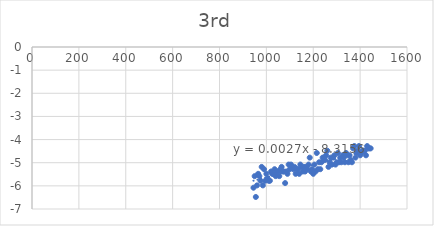
| Category | Series 0 |
|---|---|
| 945.0 | -6.08 |
| 950.0 | -5.58 |
| 955.0 | -6.48 |
| 960.0 | -5.98 |
| 965.0 | -5.48 |
| 970.0 | -5.58 |
| 975.0 | -5.78 |
| 980.0 | -5.18 |
| 985.0 | -5.98 |
| 990.0 | -5.28 |
| 995.0 | -5.78 |
| 1000.0 | -5.48 |
| 1005.0 | -5.68 |
| 1010.0 | -5.78 |
| 1015.0 | -5.78 |
| 1020.0 | -5.38 |
| 1025.0 | -5.48 |
| 1030.0 | -5.48 |
| 1035.0 | -5.28 |
| 1040.0 | -5.58 |
| 1045.0 | -5.38 |
| 1050.0 | -5.38 |
| 1055.0 | -5.58 |
| 1060.0 | -5.28 |
| 1065.0 | -5.18 |
| 1070.0 | -5.38 |
| 1075.0 | -5.38 |
| 1080.0 | -5.88 |
| 1085.0 | -5.38 |
| 1090.0 | -5.48 |
| 1095.0 | -5.08 |
| 1100.0 | -5.28 |
| 1105.0 | -5.08 |
| 1110.0 | -5.18 |
| 1115.0 | -5.28 |
| 1120.0 | -5.18 |
| 1125.0 | -5.48 |
| 1130.0 | -5.28 |
| 1135.0 | -5.28 |
| 1140.0 | -5.48 |
| 1145.0 | -5.08 |
| 1150.0 | -5.18 |
| 1155.0 | -5.38 |
| 1160.0 | -5.18 |
| 1165.0 | -5.38 |
| 1170.0 | -5.18 |
| 1175.0 | -5.28 |
| 1180.0 | -5.08 |
| 1185.0 | -4.78 |
| 1190.0 | -5.38 |
| 1195.0 | -5.28 |
| 1200.0 | -5.48 |
| 1205.0 | -5.08 |
| 1210.0 | -5.38 |
| 1215.0 | -4.58 |
| 1220.0 | -5.28 |
| 1225.0 | -4.98 |
| 1230.0 | -5.28 |
| 1235.0 | -4.98 |
| 1240.0 | -4.78 |
| 1245.0 | -4.78 |
| 1250.0 | -4.88 |
| 1255.0 | -4.68 |
| 1260.0 | -4.48 |
| 1265.0 | -5.18 |
| 1270.0 | -4.98 |
| 1275.0 | -4.78 |
| 1280.0 | -5.08 |
| 1285.0 | -4.78 |
| 1290.0 | -4.68 |
| 1295.0 | -5.08 |
| 1300.0 | -4.98 |
| 1305.0 | -4.58 |
| 1310.0 | -4.98 |
| 1315.0 | -4.78 |
| 1320.0 | -4.98 |
| 1325.0 | -4.68 |
| 1330.0 | -4.78 |
| 1335.0 | -4.98 |
| 1340.0 | -4.58 |
| 1345.0 | -4.68 |
| 1350.0 | -4.98 |
| 1355.0 | -4.68 |
| 1360.0 | -4.88 |
| 1365.0 | -4.98 |
| 1370.0 | -4.38 |
| 1375.0 | -4.28 |
| 1380.0 | -4.78 |
| 1385.0 | -4.58 |
| 1390.0 | -4.48 |
| 1395.0 | -4.28 |
| 1400.0 | -4.68 |
| 1405.0 | -4.58 |
| 1410.0 | -4.48 |
| 1415.0 | -4.48 |
| 1420.0 | -4.48 |
| 1425.0 | -4.68 |
| 1430.0 | -4.28 |
| 1435.0 | -4.38 |
| 1440.0 | -4.38 |
| 1445.0 | -4.38 |